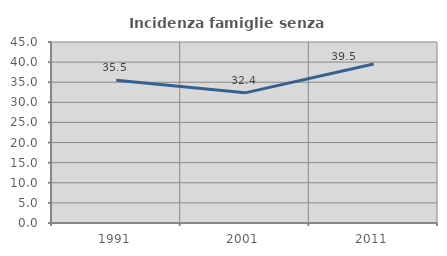
| Category | Incidenza famiglie senza nuclei |
|---|---|
| 1991.0 | 35.484 |
| 2001.0 | 32.36 |
| 2011.0 | 39.535 |